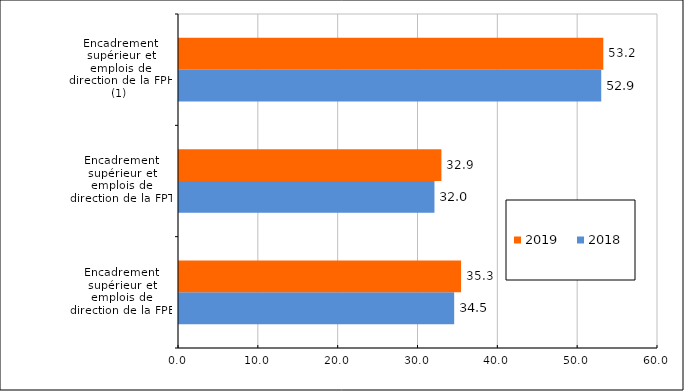
| Category | 2018 | 2019 |
|---|---|---|
| Encadrement supérieur et emplois de direction de la FPE | 34.47 | 35.33 |
| Encadrement supérieur et emplois de direction de la FPT | 32 | 32.87 |
| Encadrement supérieur et emplois de direction de la FPH (1) | 52.89 | 53.15 |